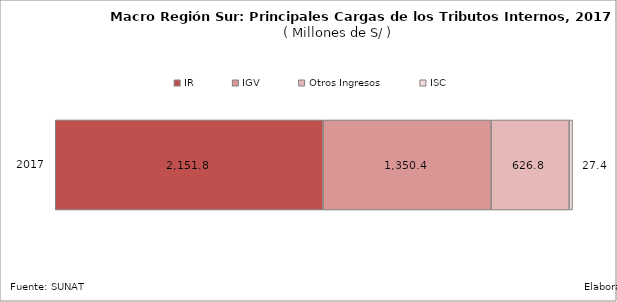
| Category | IR | IGV | Otros Ingresos | ISC |
|---|---|---|---|---|
| 2017.0 | 2151.766 | 1350.41 | 626.821 | 27.379 |